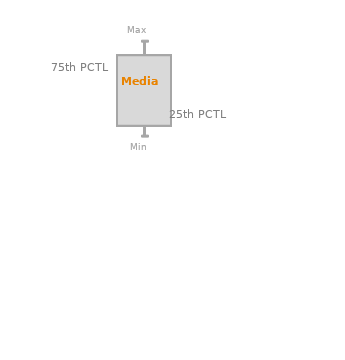
| Category | 25th PCTL | Min | Median | Max | 75th PCTL |
|---|---|---|---|---|---|
|  | 4096 | 1911 | 11000 | 22000 | 19000 |